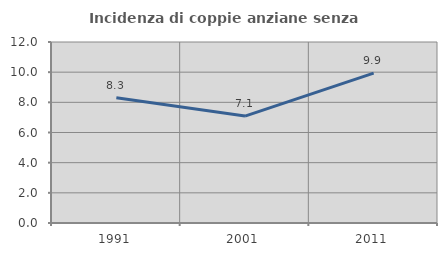
| Category | Incidenza di coppie anziane senza figli  |
|---|---|
| 1991.0 | 8.297 |
| 2001.0 | 7.088 |
| 2011.0 | 9.934 |